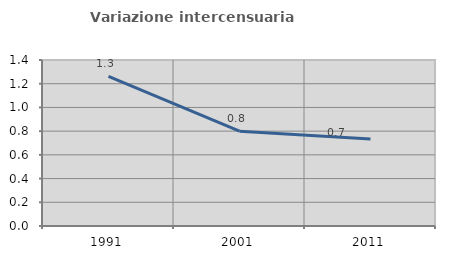
| Category | Variazione intercensuaria annua |
|---|---|
| 1991.0 | 1.262 |
| 2001.0 | 0.8 |
| 2011.0 | 0.733 |